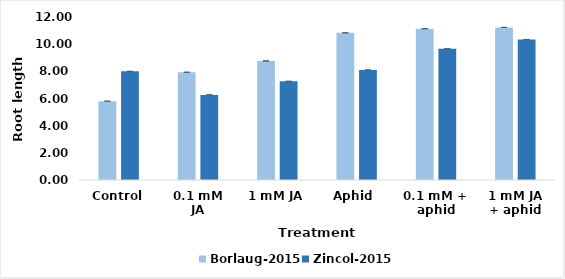
| Category | Borlaug-2015 | Zincol-2015 |
|---|---|---|
| Control | 5.8 | 8 |
| 0.1 mM JA | 7.933 | 6.267 |
| 1 mM JA | 8.767 | 7.267 |
| Aphid  | 10.833 | 8.1 |
| 0.1 mM + aphid | 11.133 | 9.667 |
| 1 mM JA + aphid | 11.233 | 10.345 |